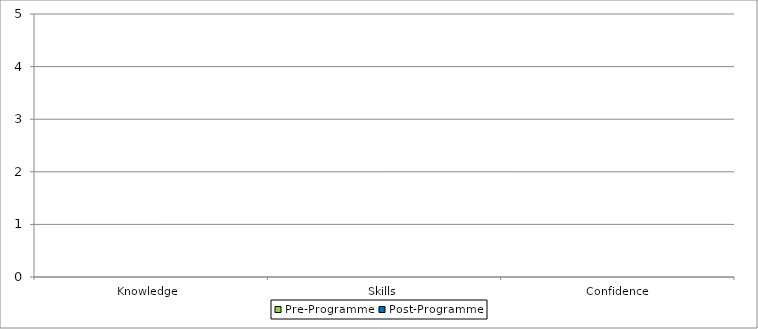
| Category | Pre-Programme | Post-Programme |
|---|---|---|
| Knowledge  | 0 | 0 |
| Skills | 0 | 0 |
| Confidence | 0 | 0 |